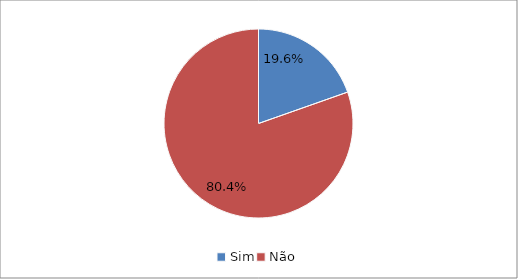
| Category | Series 0 |
|---|---|
| Sim | 0.196 |
| Não | 0.804 |